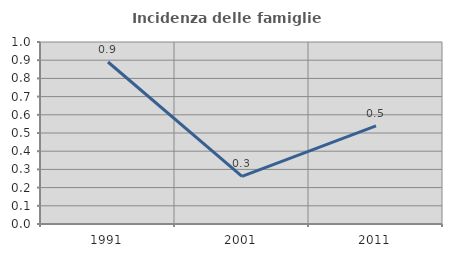
| Category | Incidenza delle famiglie numerose |
|---|---|
| 1991.0 | 0.89 |
| 2001.0 | 0.262 |
| 2011.0 | 0.539 |